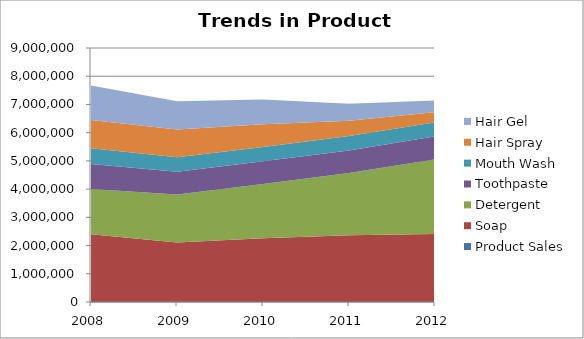
| Category | Product Sales | Soap | Detergent | Toothpaste | Mouth Wash | Hair Spray | Hair Gel |
|---|---|---|---|---|---|---|---|
| 2008.0 | 2008 | 2400000 | 1605000 | 880000 | 560000 | 1006000 | 1220000 |
| 2009.0 | 2009 | 2105000 | 1705000 | 806000 | 510000 | 980500 | 1005000 |
| 2010.0 | 2010 | 2260000 | 1920000 | 801000 | 513000 | 806400 | 870000 |
| 2011.0 | 2011 | 2365000 | 2200000 | 803000 | 511000 | 540000 | 602000 |
| 2012.0 | 2012 | 2405000 | 2650000 | 809000 | 502000 | 360000 | 414000 |